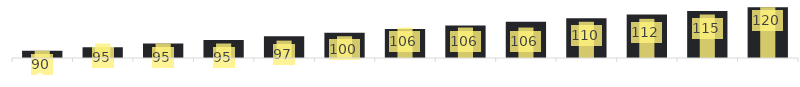
| Category | Bankdrücken - Summe von Ziel |
|---|---|
| 0 | 90 |
| 1 | 92.5 |
| 2 | 95 |
| 3 | 97.5 |
| 4 | 100 |
| 5 | 102.5 |
| 6 | 105 |
| 7 | 107.5 |
| 8 | 110 |
| 9 | 112.5 |
| 10 | 115 |
| 11 | 117.5 |
| 12 | 120 |